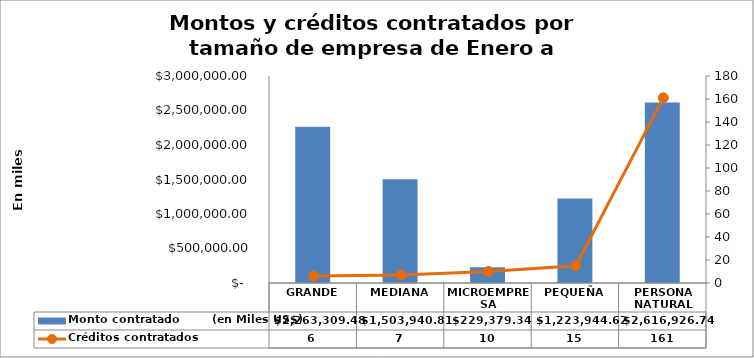
| Category | Monto contratado        (en Miles US$) |
|---|---|
| GRANDE | 2263309.48 |
| MEDIANA | 1503940.81 |
| MICROEMPRESA | 229379.34 |
| PEQUEÑA | 1223944.62 |
| PERSONA NATURAL | 2616926.74 |